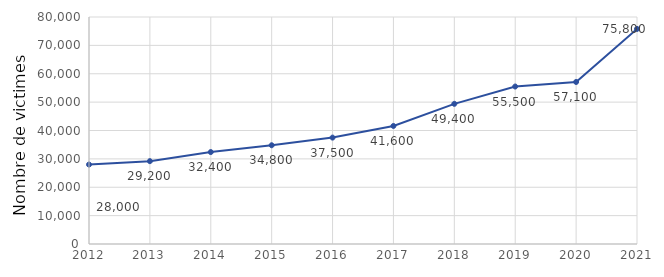
| Category | Series 0 |
|---|---|
| 2012.0 | 28000 |
| 2013.0 | 29200 |
| 2014.0 | 32400 |
| 2015.0 | 34800 |
| 2016.0 | 37500 |
| 2017.0 | 41600 |
| 2018.0 | 49400 |
| 2019.0 | 55500 |
| 2020.0 | 57100 |
| 2021.0 | 75800 |